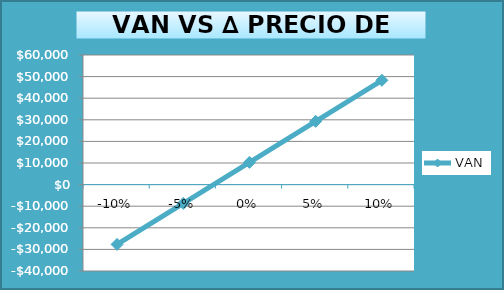
| Category | VAN |
|---|---|
| -0.1 | -27682.089 |
| -0.05 | -8690.534 |
| 0.0 | 10301.021 |
| 0.05 | 29292.576 |
| 0.1 | 48284.132 |